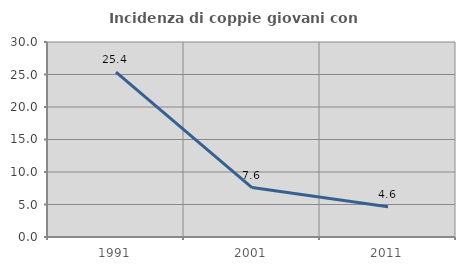
| Category | Incidenza di coppie giovani con figli |
|---|---|
| 1991.0 | 25.373 |
| 2001.0 | 7.609 |
| 2011.0 | 4.639 |